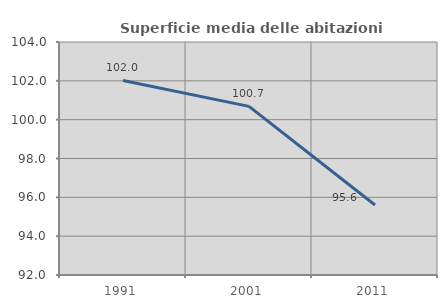
| Category | Superficie media delle abitazioni occupate |
|---|---|
| 1991.0 | 102.021 |
| 2001.0 | 100.685 |
| 2011.0 | 95.602 |